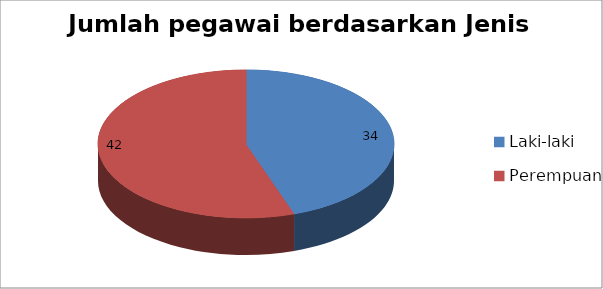
| Category | Jlh |
|---|---|
| Laki-laki | 34 |
| Perempuan | 42 |